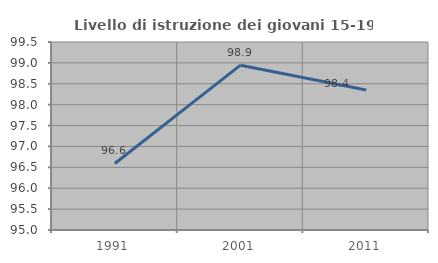
| Category | Livello di istruzione dei giovani 15-19 anni |
|---|---|
| 1991.0 | 96.592 |
| 2001.0 | 98.946 |
| 2011.0 | 98.351 |